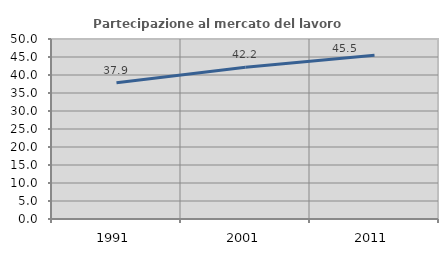
| Category | Partecipazione al mercato del lavoro  femminile |
|---|---|
| 1991.0 | 37.874 |
| 2001.0 | 42.151 |
| 2011.0 | 45.459 |